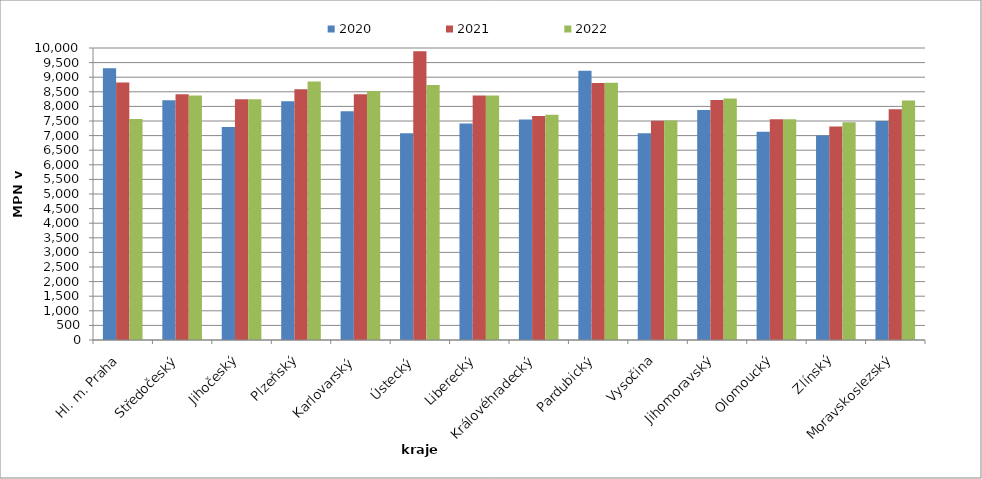
| Category | 2020 | 2021 | 2022 |
|---|---|---|---|
| Hl. m. Praha | 9305 | 8820 | 7565 |
| Středočeský | 8207 | 8415 | 8374 |
| Jihočeský | 7298 | 8243 | 8243 |
| Plzeňský | 8179 | 8588 | 8851 |
| Karlovarský  | 7831 | 8420 | 8524 |
| Ústecký   | 7080 | 9887 | 8732 |
| Liberecký | 7411 | 8371 | 8371 |
| Královéhradecký | 7554 | 7673 | 7712 |
| Pardubický | 9218 | 8800 | 8811 |
| Vysočina | 7077 | 7510 | 7516 |
| Jihomoravský | 7876 | 8218 | 8274 |
| Olomoucký | 7128 | 7556 | 7556 |
| Zlínský | 7006 | 7314 | 7458 |
| Moravskoslezský | 7504 | 7906 | 8202 |